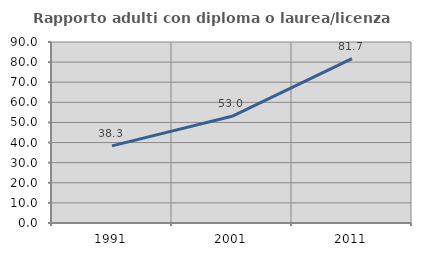
| Category | Rapporto adulti con diploma o laurea/licenza media  |
|---|---|
| 1991.0 | 38.34 |
| 2001.0 | 53.049 |
| 2011.0 | 81.721 |